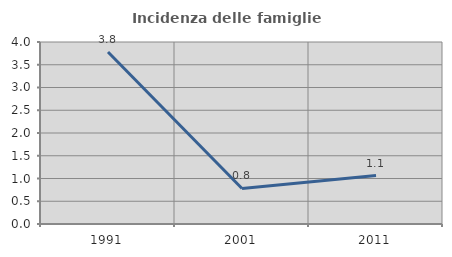
| Category | Incidenza delle famiglie numerose |
|---|---|
| 1991.0 | 3.782 |
| 2001.0 | 0.781 |
| 2011.0 | 1.064 |